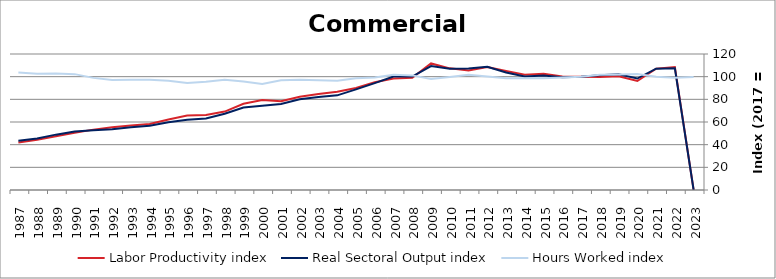
| Category | Labor Productivity index | Real Sectoral Output index | Hours Worked index |
|---|---|---|---|
| 2023.0 | 0 | 0 | 99.768 |
| 2022.0 | 108.547 | 107.427 | 98.968 |
| 2021.0 | 107.112 | 107.031 | 99.925 |
| 2020.0 | 96.158 | 98.337 | 102.266 |
| 2019.0 | 100.26 | 102.214 | 101.95 |
| 2018.0 | 99.666 | 101.334 | 101.674 |
| 2017.0 | 100 | 100 | 100 |
| 2016.0 | 100.257 | 99.437 | 99.182 |
| 2015.0 | 102.509 | 101.041 | 98.568 |
| 2014.0 | 101.669 | 100.182 | 98.538 |
| 2013.0 | 105.012 | 103.643 | 98.697 |
| 2012.0 | 108.529 | 108.759 | 100.212 |
| 2011.0 | 105.454 | 107.174 | 101.632 |
| 2010.0 | 107.326 | 107.009 | 99.704 |
| 2009.0 | 111.666 | 109.313 | 97.893 |
| 2008.0 | 98.954 | 100.074 | 101.132 |
| 2007.0 | 98.386 | 100.104 | 101.746 |
| 2006.0 | 95.082 | 94.314 | 99.193 |
| 2005.0 | 89.986 | 88.818 | 98.702 |
| 2004.0 | 86.683 | 83.512 | 96.341 |
| 2003.0 | 84.751 | 82.077 | 96.844 |
| 2002.0 | 82.342 | 80.031 | 97.193 |
| 2001.0 | 78.327 | 75.827 | 96.808 |
| 2000.0 | 79.302 | 74.247 | 93.626 |
| 1999.0 | 76.09 | 72.84 | 95.728 |
| 1998.0 | 69.174 | 67.24 | 97.203 |
| 1997.0 | 66.124 | 63.106 | 95.435 |
| 1996.0 | 65.664 | 61.977 | 94.385 |
| 1995.0 | 62.148 | 59.872 | 96.337 |
| 1994.0 | 58.31 | 56.699 | 97.237 |
| 1993.0 | 56.908 | 55.345 | 97.254 |
| 1992.0 | 55.301 | 53.631 | 96.98 |
| 1991.0 | 53.276 | 52.708 | 98.934 |
| 1990.0 | 50.462 | 51.592 | 102.238 |
| 1989.0 | 47.488 | 48.844 | 102.856 |
| 1988.0 | 44.39 | 45.488 | 102.475 |
| 1987.0 | 41.867 | 43.396 | 103.651 |